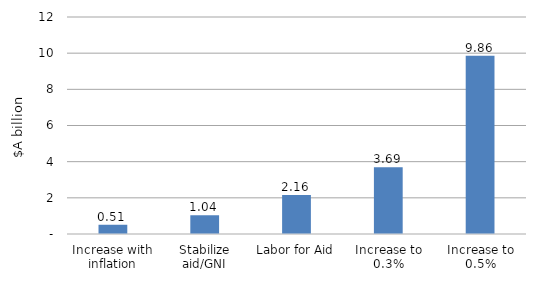
| Category | Series 0 |
|---|---|
| Increase with inflation | 0.511 |
| Stabilize aid/GNI | 1.037 |
| Labor for Aid | 2.157 |
| Increase to 0.3% | 3.693 |
| Increase to 0.5% | 9.856 |